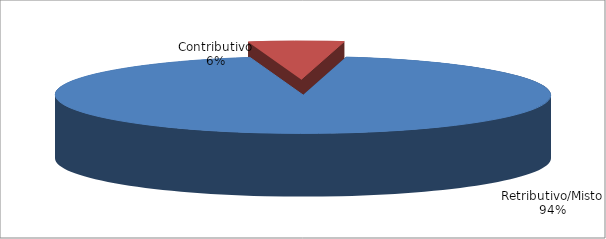
| Category | Series 1 |
|---|---|
| Retributivo/Misto | 10257 |
| Contributivo | 679 |